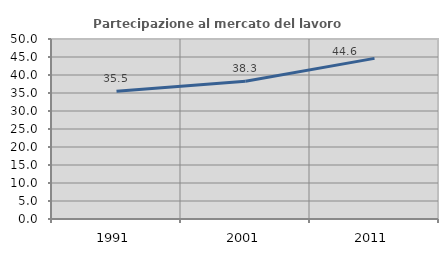
| Category | Partecipazione al mercato del lavoro  femminile |
|---|---|
| 1991.0 | 35.48 |
| 2001.0 | 38.25 |
| 2011.0 | 44.615 |